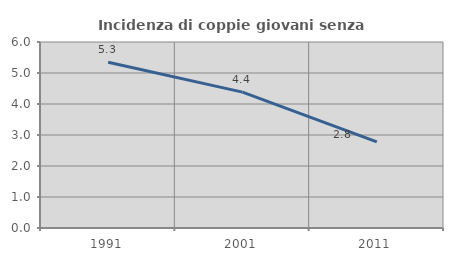
| Category | Incidenza di coppie giovani senza figli |
|---|---|
| 1991.0 | 5.345 |
| 2001.0 | 4.384 |
| 2011.0 | 2.778 |